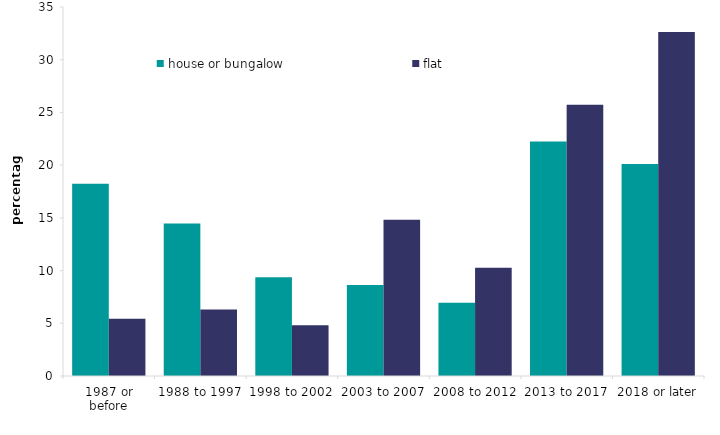
| Category | house or bungalow | flat |
|---|---|---|
| 1987 or before | 18.245 | 5.437 |
| 1988 to 1997 | 14.469 | 6.31 |
| 1998 to 2002 | 9.364 | 4.809 |
| 2003 to 2007 | 8.626 | 14.818 |
| 2008 to 2012 | 6.959 | 10.275 |
| 2013 to 2017 | 22.24 | 25.717 |
| 2018 or later | 20.097 | 32.635 |